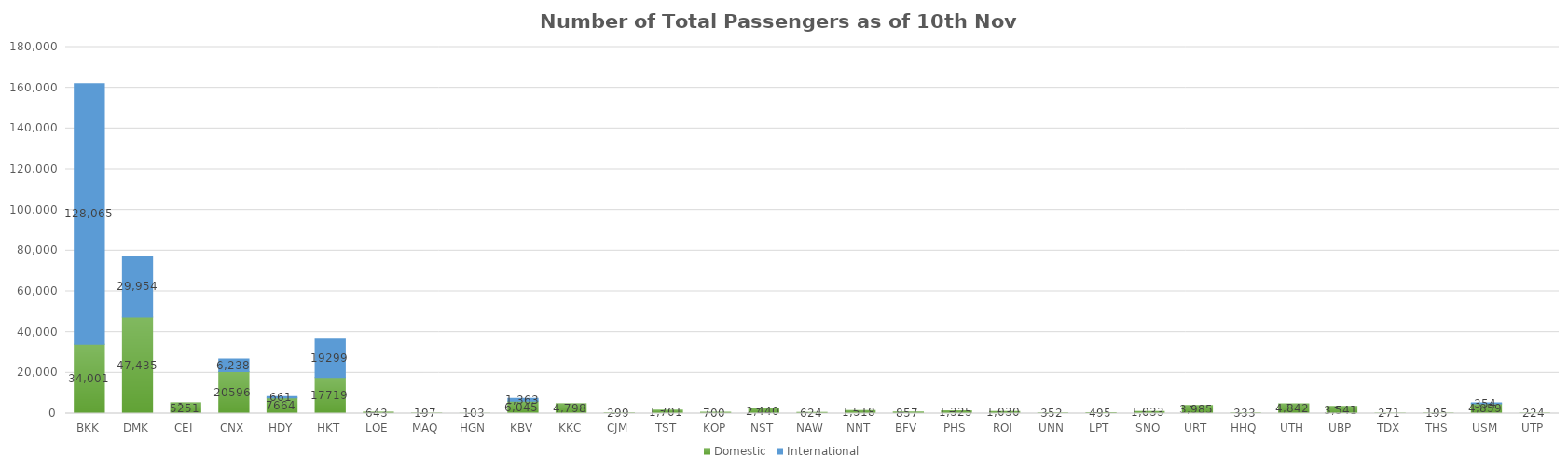
| Category | Domestic | International |
|---|---|---|
| BKK | 34001 | 128065 |
| DMK | 47435 | 29954 |
| CEI | 5251 | 0 |
| CNX | 20596 | 6238 |
| HDY | 7664 | 661 |
| HKT | 17719 | 19299 |
| LOE | 643 | 0 |
| MAQ | 197 | 0 |
| HGN | 103 | 0 |
| KBV | 6045 | 1363 |
| KKC | 4798 | 0 |
| CJM | 299 | 0 |
| TST | 1701 | 0 |
| KOP | 700 | 0 |
| NST | 2440 | 0 |
| NAW | 624 | 0 |
| NNT | 1518 | 0 |
| BFV | 857 | 0 |
| PHS | 1325 | 0 |
| ROI | 1030 | 0 |
| UNN | 352 | 0 |
| LPT | 495 | 0 |
| SNO | 1033 | 0 |
| URT | 3985 | 0 |
| HHQ | 333 | 0 |
| UTH | 4842 | 0 |
| UBP | 3541 | 0 |
| TDX | 271 | 0 |
| THS | 195 | 0 |
| USM | 4859 | 354 |
| UTP | 224 | 0 |